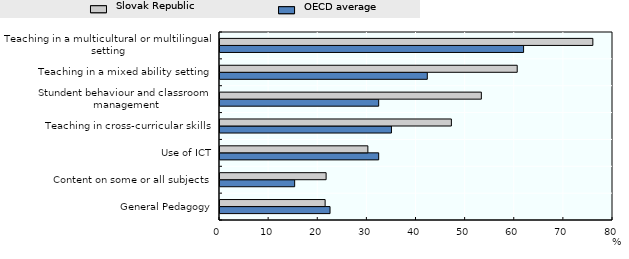
| Category | OECD average | Slovak Republic |
|---|---|---|
| General Pedagogy | 22.4 | 21.4 |
| Content on some or all subjects | 15.2 | 21.6 |
| Use of ICT | 32.3 | 30.1 |
| Teaching in cross-curricular skills | 34.9 | 47.1 |
| Stundent behaviour and classroom management | 32.3 | 53.2 |
| Teaching in a mixed ability setting | 42.2 | 60.5 |
| Teaching in a multicultural or multilingual setting | 61.8 | 75.9 |